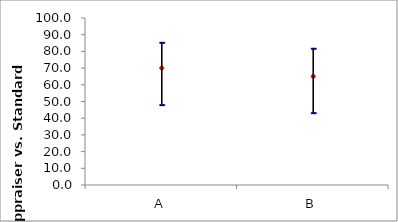
| Category | Percent | 95.0% LC (Score) | 95.0% UC (Score) |
|---|---|---|---|
| A | 70 | 48.103 | 85.452 |
| B | 65 | 43.285 | 81.881 |